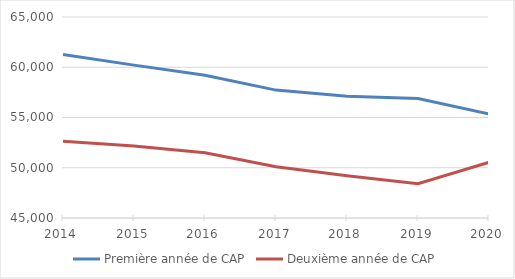
| Category | Première année de CAP | Deuxième année de CAP |
|---|---|---|
| 2014.0 | 61269 | 52645 |
| 2015.0 | 60213 | 52158 |
| 2016.0 | 59202 | 51490 |
| 2017.0 | 57727 | 50096 |
| 2018.0 | 57125 | 49203 |
| 2019.0 | 56897 | 48412 |
| 2020.0 | 55348 | 50544 |